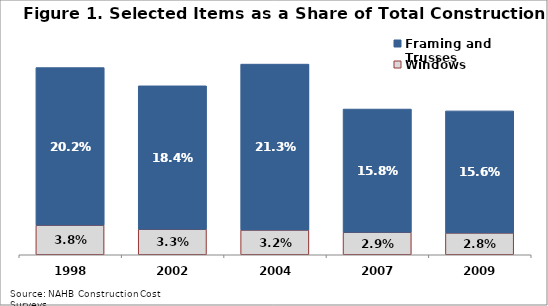
| Category | Windows | Framing and Trusses |
|---|---|---|
| 1998.0 | 0.038 | 0.202 |
| 2002.0 | 0.033 | 0.184 |
| 2004.0 | 0.032 | 0.213 |
| 2007.0 | 0.029 | 0.158 |
| 2009.0 | 0.028 | 0.156 |